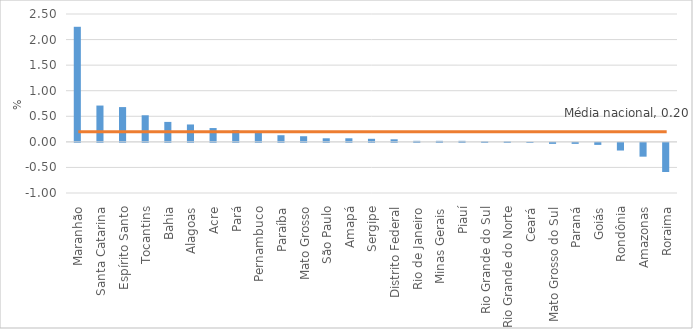
| Category | Escolha |
|---|---|
| Maranhão | 2.25 |
| Santa Catarina | 0.71 |
| Espírito Santo | 0.68 |
| Tocantins | 0.52 |
| Bahia | 0.39 |
| Alagoas | 0.34 |
| Acre | 0.27 |
| Pará | 0.23 |
| Pernambuco | 0.2 |
| Paraíba | 0.13 |
| Mato Grosso | 0.11 |
| São Paulo | 0.07 |
| Amapá | 0.07 |
| Sergipe | 0.06 |
| Distrito Federal | 0.05 |
| Rio de Janeiro | 0.02 |
| Minas Gerais | 0.02 |
| Piauí | 0.02 |
| Rio Grande do Sul | 0.01 |
| Rio Grande do Norte | 0.01 |
| Ceará | 0 |
| Mato Grosso do Sul | -0.02 |
| Paraná | -0.02 |
| Goiás | -0.04 |
| Rondônia | -0.15 |
| Amazonas | -0.27 |
| Roraima | -0.57 |